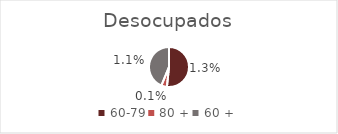
| Category | Desocupados | Ocupados | Inactivos |
|---|---|---|---|
| 60-79 | 0.012 | 0.361 | 0.627 |
| 80 + | 0.001 | 0.044 | 0.954 |
| 60 + | 0.011 | 0.308 | 0.682 |